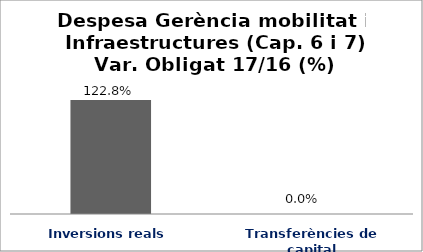
| Category | Series 0 |
|---|---|
| Inversions reals | 1.228 |
| Transferències de capital | 0 |